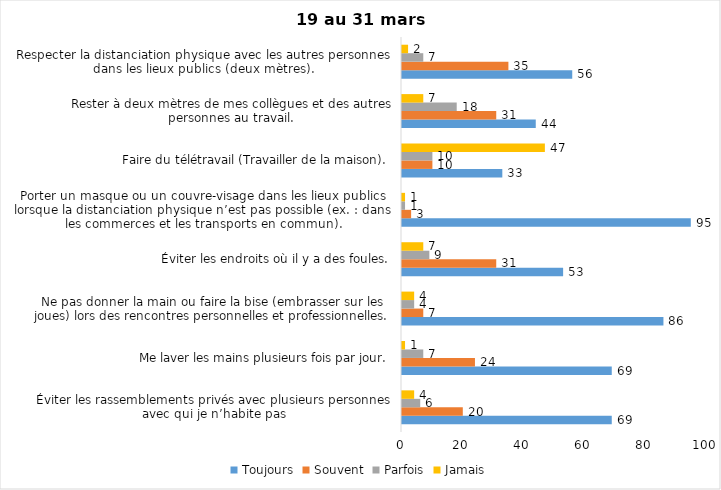
| Category | Toujours | Souvent | Parfois | Jamais |
|---|---|---|---|---|
| Éviter les rassemblements privés avec plusieurs personnes avec qui je n’habite pas | 69 | 20 | 6 | 4 |
| Me laver les mains plusieurs fois par jour. | 69 | 24 | 7 | 1 |
| Ne pas donner la main ou faire la bise (embrasser sur les joues) lors des rencontres personnelles et professionnelles. | 86 | 7 | 4 | 4 |
| Éviter les endroits où il y a des foules. | 53 | 31 | 9 | 7 |
| Porter un masque ou un couvre-visage dans les lieux publics lorsque la distanciation physique n’est pas possible (ex. : dans les commerces et les transports en commun). | 95 | 3 | 1 | 1 |
| Faire du télétravail (Travailler de la maison). | 33 | 10 | 10 | 47 |
| Rester à deux mètres de mes collègues et des autres personnes au travail. | 44 | 31 | 18 | 7 |
| Respecter la distanciation physique avec les autres personnes dans les lieux publics (deux mètres). | 56 | 35 | 7 | 2 |